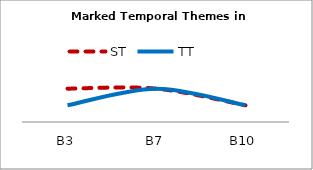
| Category | ST | TT |
|---|---|---|
| B3 | 2 | 1 |
| B7 | 2 | 2 |
| B10 | 1 | 1 |